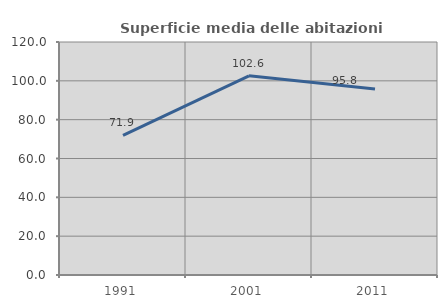
| Category | Superficie media delle abitazioni occupate |
|---|---|
| 1991.0 | 71.923 |
| 2001.0 | 102.59 |
| 2011.0 | 95.812 |